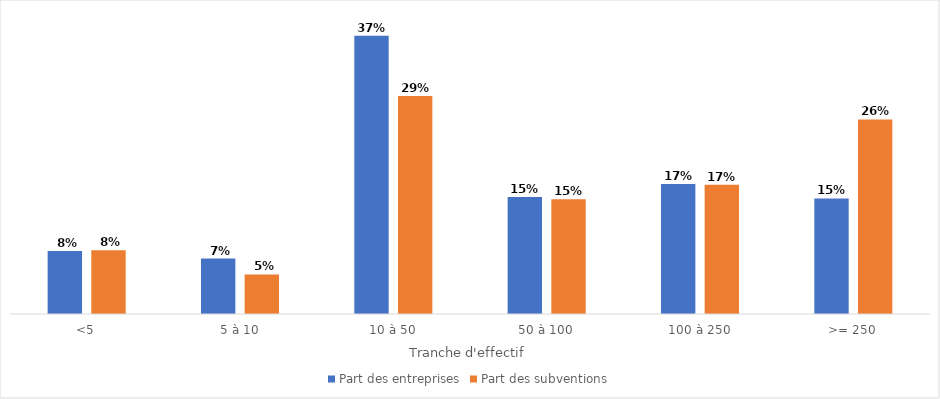
| Category | Part des entreprises | Part des subventions |
|---|---|---|
| <5 | 0.083 | 0.084 |
| 5 à 10 | 0.073 | 0.052 |
| 10 à 50 | 0.366 | 0.287 |
| 50 à 100 | 0.154 | 0.151 |
| 100 à 250 | 0.171 | 0.17 |
| >= 250 | 0.152 | 0.256 |